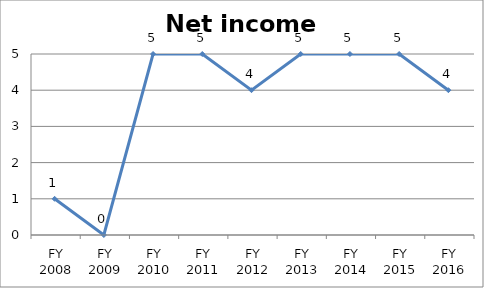
| Category | Net income score |
|---|---|
| FY 2016 | 4 |
| FY 2015 | 5 |
| FY 2014 | 5 |
| FY 2013 | 5 |
| FY 2012 | 4 |
| FY 2011 | 5 |
| FY 2010 | 5 |
| FY 2009 | 0 |
| FY 2008 | 1 |